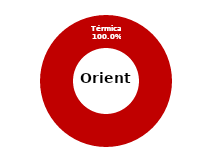
| Category | Oriente |
|---|---|
| Eólica | 0 |
| Hidráulica | 0 |
| Solar | 0 |
| Térmica | 33.527 |